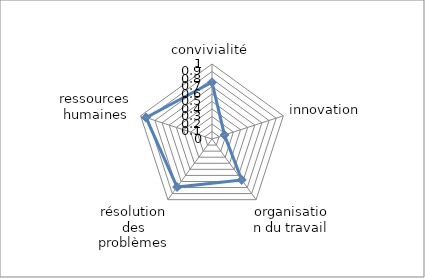
| Category | Series 0 |
|---|---|
| convivialité | 0.756 |
| innovation | 0.175 |
| organisation du travail | 0.675 |
| résolution des problèmes | 0.792 |
| ressources humaines | 0.925 |